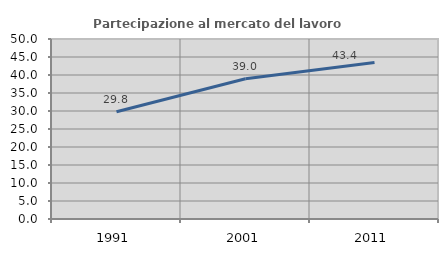
| Category | Partecipazione al mercato del lavoro  femminile |
|---|---|
| 1991.0 | 29.787 |
| 2001.0 | 38.956 |
| 2011.0 | 43.448 |